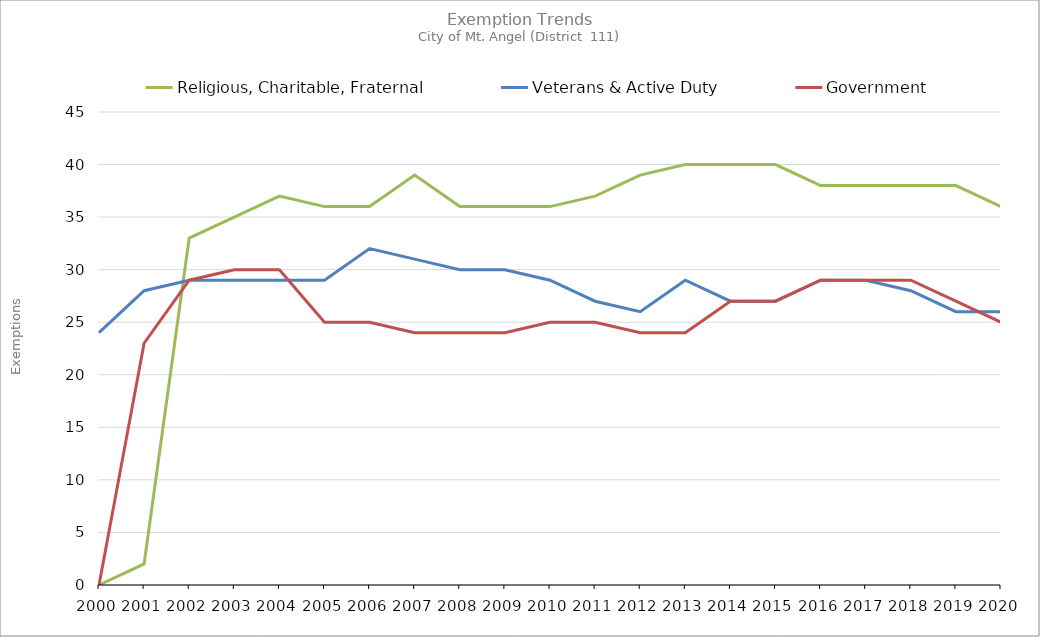
| Category | Religious, Charitable, Fraternal | Veterans & Active Duty | Government |
|---|---|---|---|
| 2000.0 | 0 | 24 | 0 |
| 2001.0 | 2 | 28 | 23 |
| 2002.0 | 33 | 29 | 29 |
| 2003.0 | 35 | 29 | 30 |
| 2004.0 | 37 | 29 | 30 |
| 2005.0 | 36 | 29 | 25 |
| 2006.0 | 36 | 32 | 25 |
| 2007.0 | 39 | 31 | 24 |
| 2008.0 | 36 | 30 | 24 |
| 2009.0 | 36 | 30 | 24 |
| 2010.0 | 36 | 29 | 25 |
| 2011.0 | 37 | 27 | 25 |
| 2012.0 | 39 | 26 | 24 |
| 2013.0 | 40 | 29 | 24 |
| 2014.0 | 40 | 27 | 27 |
| 2015.0 | 40 | 27 | 27 |
| 2016.0 | 38 | 29 | 29 |
| 2017.0 | 38 | 29 | 29 |
| 2018.0 | 38 | 28 | 29 |
| 2019.0 | 38 | 26 | 27 |
| 2020.0 | 36 | 26 | 25 |